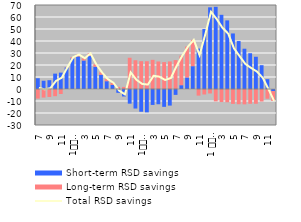
| Category | Short-term RSD savings | Long-term RSD savings |
|---|---|---|
| 7 | 8.967 | -8.007 |
| 8 | 6.881 | -7.127 |
| 9 | 7.334 | -6.641 |
| 10 | 12.813 | -6.007 |
| 11 | 13.648 | -4.166 |
| 12 | 18.05 | 0.294 |
| 1
2010 | 25.514 | 1.025 |
| 2 | 27.133 | 1.63 |
| 3 | 23.763 | 1.853 |
| 4 | 27.466 | 2.243 |
| 5 | 18.567 | 2.036 |
| 6 | 11.917 | 1.974 |
| 7 | 6.511 | 1.776 |
| 8 | 3.395 | 1.779 |
| 9 | -3.175 | 1.796 |
| 10 | -6.226 | 1.732 |
| 11 | -12.197 | 26.048 |
| 12 | -16.272 | 23.969 |
| 1
2011 | -18.953 | 23.187 |
| 2 | -19.451 | 23.151 |
| 3 | -13.279 | 24.31 |
| 4 | -12.705 | 22.948 |
| 5 | -14.873 | 22.418 |
| 6 | -13.828 | 22.982 |
| 7 | -4.9 | 24.093 |
| 8 | 3.184 | 24.616 |
| 9 | 9.636 | 25.772 |
| 10 | 19.032 | 21.942 |
| 11 | 33.693 | -5.515 |
| 12 | 49.999 | -4.559 |
| 1 
2012 | 68.061 | -3.733 |
| 2 | 68.514 | -10.31 |
| 3 | 61.829 | -10.877 |
| 4 | 57.182 | -11.055 |
| 5 | 46.29 | -12.401 |
| 6 | 39.941 | -12.695 |
| 7 | 33.564 | -12.787 |
| 8 | 29.796 | -12.282 |
| 9 | 26.872 | -12.312 |
| 10 | 19.835 | -10.423 |
| 11 | 8.184 | -8.106 |
| 12 | -1.74 | -8.274 |